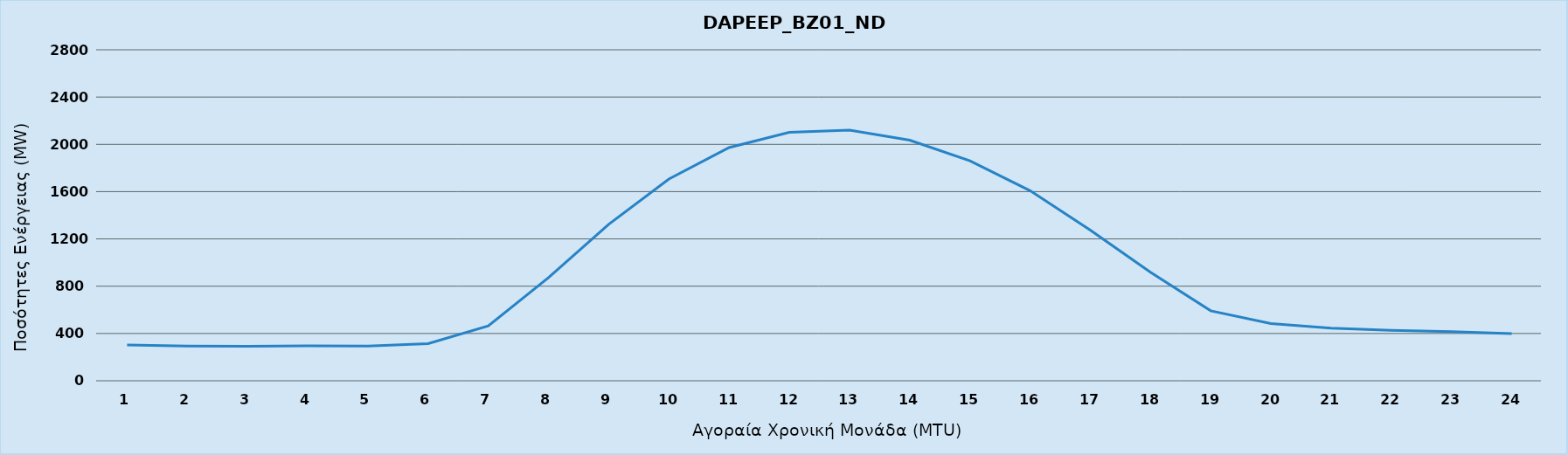
| Category | DAPEEP_BZ01_NDR |
|---|---|
| 0 | 302 |
| 1 | 293 |
| 2 | 292 |
| 3 | 296 |
| 4 | 293 |
| 5 | 314 |
| 6 | 464 |
| 7 | 873 |
| 8 | 1323 |
| 9 | 1707 |
| 10 | 1973 |
| 11 | 2102 |
| 12 | 2121 |
| 13 | 2035 |
| 14 | 1861 |
| 15 | 1608 |
| 16 | 1275 |
| 17 | 918 |
| 18 | 592 |
| 19 | 484 |
| 20 | 446 |
| 21 | 427 |
| 22 | 415 |
| 23 | 399 |